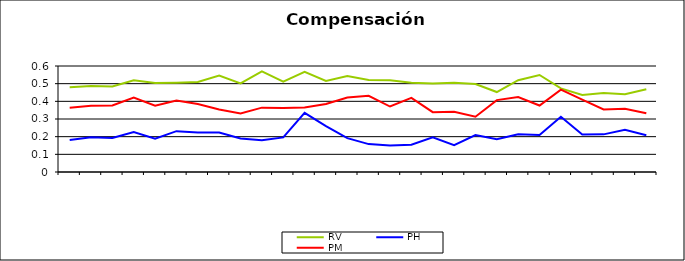
| Category | RV | PH | PM |
|---|---|---|---|
| 0 | 0.479 | 0.181 | 0.364 |
| 1 | 0.487 | 0.196 | 0.375 |
| 2 | 0.484 | 0.192 | 0.376 |
| 3 | 0.52 | 0.226 | 0.421 |
| 4 | 0.504 | 0.189 | 0.375 |
| 5 | 0.506 | 0.231 | 0.404 |
| 6 | 0.51 | 0.224 | 0.384 |
| 7 | 0.546 | 0.223 | 0.353 |
| 8 | 0.501 | 0.19 | 0.331 |
| 9 | 0.57 | 0.18 | 0.364 |
| 10 | 0.511 | 0.196 | 0.363 |
| 11 | 0.567 | 0.335 | 0.365 |
| 12 | 0.515 | 0.26 | 0.385 |
| 13 | 0.543 | 0.192 | 0.422 |
| 14 | 0.52 | 0.158 | 0.431 |
| 15 | 0.519 | 0.15 | 0.371 |
| 16 | 0.505 | 0.154 | 0.42 |
| 17 | 0.501 | 0.196 | 0.339 |
| 18 | 0.506 | 0.151 | 0.341 |
| 19 | 0.498 | 0.209 | 0.313 |
| 20 | 0.453 | 0.186 | 0.407 |
| 21 | 0.52 | 0.213 | 0.424 |
| 22 | 0.549 | 0.21 | 0.376 |
| 23 | 0.473 | 0.312 | 0.466 |
| 24 | 0.436 | 0.212 | 0.41 |
| 25 | 0.447 | 0.213 | 0.354 |
| 26 | 0.44 | 0.238 | 0.358 |
| 27 | 0.469 | 0.208 | 0.332 |